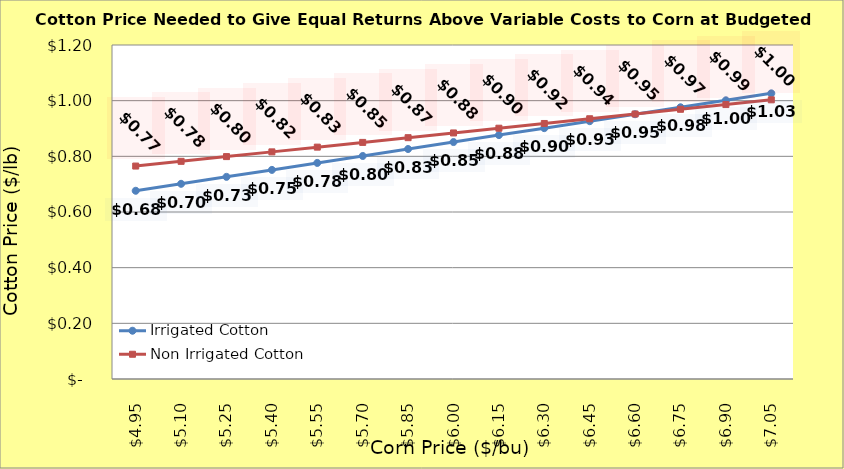
| Category | Irrigated Cotton | Non Irrigated Cotton |
|---|---|---|
| 4.9499999999999975 | 0.676 | 0.765 |
| 5.099999999999998 | 0.701 | 0.782 |
| 5.249999999999998 | 0.726 | 0.799 |
| 5.399999999999999 | 0.751 | 0.816 |
| 5.549999999999999 | 0.776 | 0.833 |
| 5.699999999999999 | 0.801 | 0.85 |
| 5.85 | 0.826 | 0.867 |
| 6.0 | 0.851 | 0.884 |
| 6.15 | 0.876 | 0.901 |
| 6.300000000000001 | 0.901 | 0.918 |
| 6.450000000000001 | 0.926 | 0.935 |
| 6.600000000000001 | 0.951 | 0.952 |
| 6.750000000000002 | 0.976 | 0.969 |
| 6.900000000000002 | 1.001 | 0.986 |
| 7.0500000000000025 | 1.026 | 1.003 |